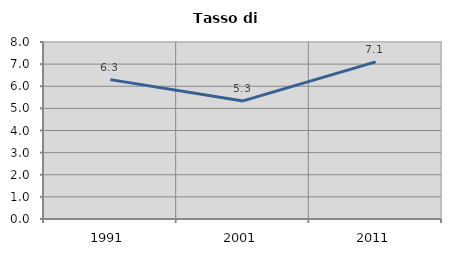
| Category | Tasso di disoccupazione   |
|---|---|
| 1991.0 | 6.3 |
| 2001.0 | 5.338 |
| 2011.0 | 7.103 |